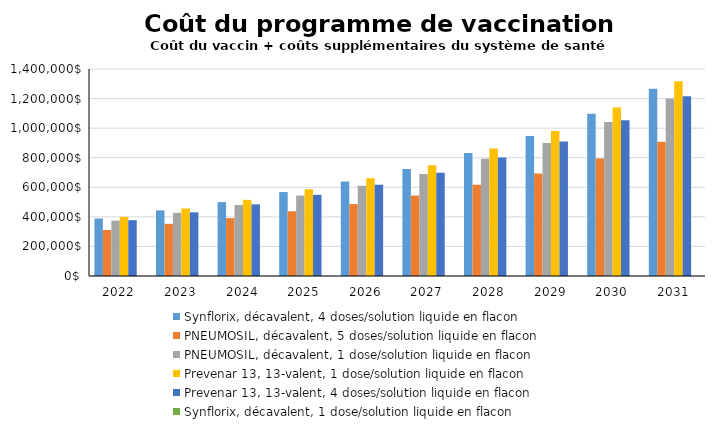
| Category | Synflorix, décavalent, 4 doses/solution liquide en flacon | PNEUMOSIL, décavalent, 5 doses/solution liquide en flacon | PNEUMOSIL, décavalent, 1 dose/solution liquide en flacon | Prevenar 13, 13-valent, 1 dose/solution liquide en flacon | Prevenar 13, 13-valent, 4 doses/solution liquide en flacon | Synflorix, décavalent, 1 dose/solution liquide en flacon |
|---|---|---|---|---|---|---|
| 2022.0 | 388770.522 | 311103.391 | 374482.884 | 399554.379 | 377675.217 | 0 |
| 2023.0 | 443929.731 | 352504.423 | 427111.141 | 456623.872 | 430868.973 | 0 |
| 2024.0 | 499987.594 | 391105.767 | 479957.704 | 515105.522 | 484433.047 | 0 |
| 2025.0 | 567813.826 | 437479.336 | 543837.506 | 585910.394 | 549194.613 | 0 |
| 2026.0 | 639259.643 | 486283.324 | 611118.135 | 660499.964 | 617405.883 | 0 |
| 2027.0 | 723821.801 | 543746.819 | 690695.225 | 748824.693 | 698096.803 | 0 |
| 2028.0 | 832124.039 | 616837.968 | 792520.035 | 862015.89 | 801368.886 | 0 |
| 2029.0 | 946272.973 | 693825.213 | 899832.708 | 981324.617 | 910209.007 | 0 |
| 2030.0 | 1097142.187 | 794955.396 | 1041551.935 | 1139099.952 | 1053972.646 | 0 |
| 2031.0 | 1266724.863 | 908422.688 | 1200811.631 | 1316474.088 | 1215538.838 | 0 |